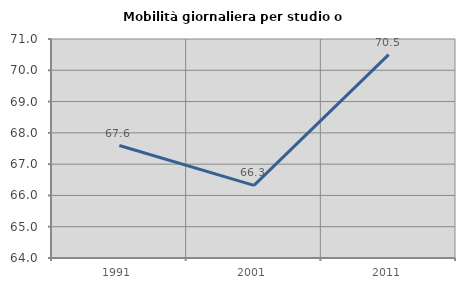
| Category | Mobilità giornaliera per studio o lavoro |
|---|---|
| 1991.0 | 67.594 |
| 2001.0 | 66.32 |
| 2011.0 | 70.502 |